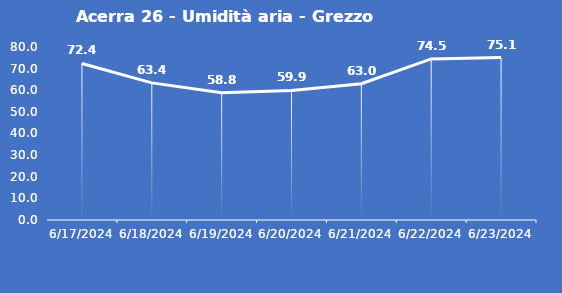
| Category | Acerra 26 - Umidità aria - Grezzo (%) |
|---|---|
| 6/17/24 | 72.4 |
| 6/18/24 | 63.4 |
| 6/19/24 | 58.8 |
| 6/20/24 | 59.9 |
| 6/21/24 | 63 |
| 6/22/24 | 74.5 |
| 6/23/24 | 75.1 |